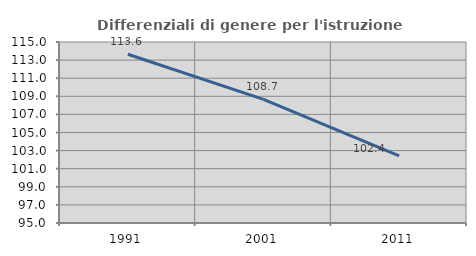
| Category | Differenziali di genere per l'istruzione superiore |
|---|---|
| 1991.0 | 113.65 |
| 2001.0 | 108.658 |
| 2011.0 | 102.422 |